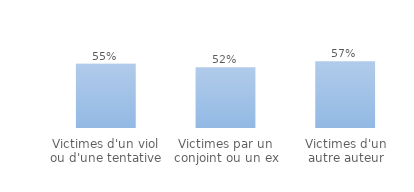
| Category | au moins une démarche |
|---|---|
| Victimes d'un viol ou d'une tentative | 0.55 |
| Victimes par un conjoint ou un ex | 0.52 |
| Victimes d'un autre auteur | 0.57 |